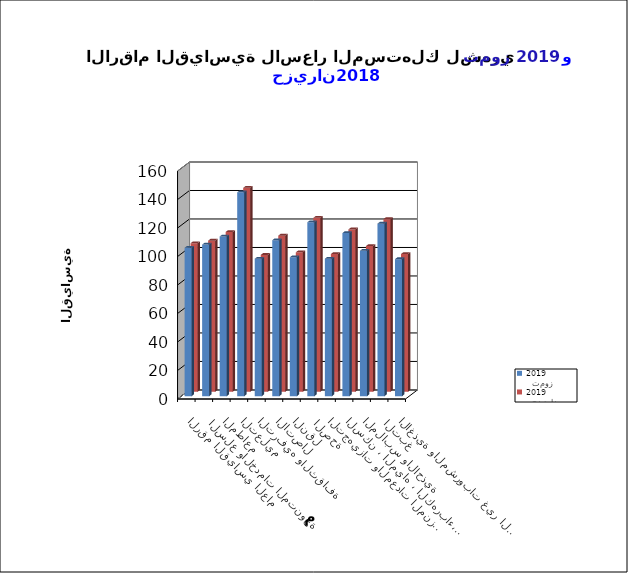
| Category |   تموز     2019      |   حزيران     2019      |
|---|---|---|
| الاغذية والمشروبات غير الكحولية | 96.2 | 96.6 |
|  التبغ | 121.1 | 121.1 |
| الملابس والاحذية | 102.1 | 102.2 |
| السكن ، المياه ، الكهرباء، الغاز  | 114.5 | 113.9 |
| التجهيزات والمعدات المنزلية والصيانة | 96.5 | 96.6 |
|  الصحة | 122.1 | 122 |
| النقل | 97.5 | 97.8 |
| الاتصال | 109.5 | 109.5 |
| الترفيه والثقافة | 96.5 | 96 |
| التعليم | 143.1 | 143.1 |
| المطاعم  | 112.1 | 112.1 |
|  السلع والخدمات المتنوعة | 106.4 | 106 |
| الرقم القياسي العام | 104.2 | 104.2 |